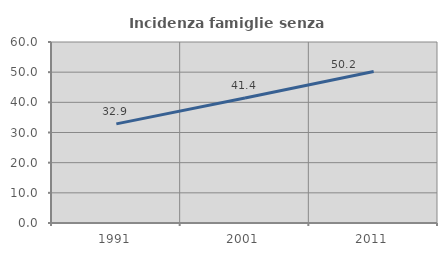
| Category | Incidenza famiglie senza nuclei |
|---|---|
| 1991.0 | 32.863 |
| 2001.0 | 41.434 |
| 2011.0 | 50.222 |